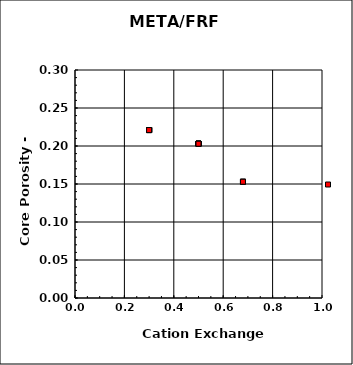
| Category | Series 0 |
|---|---|
| 0.68 | 0.153 |
| 0.68 | 0.153 |
| 0.68 | 0.153 |
| 0.5 | 0.203 |
| 0.5 | 0.203 |
| 0.5 | 0.203 |
| 0.5 | 0.203 |
| 0.5 | 0.203 |
| 0.5 | 0.203 |
| 0.5 | 0.203 |
| 0.3 | 0.221 |
| 0.3 | 0.221 |
| 0.3 | 0.221 |
| 0.3 | 0.221 |
| 0.3 | 0.221 |
| 0.3 | 0.221 |
| 0.3 | 0.221 |
| 0.3 | 0.221 |